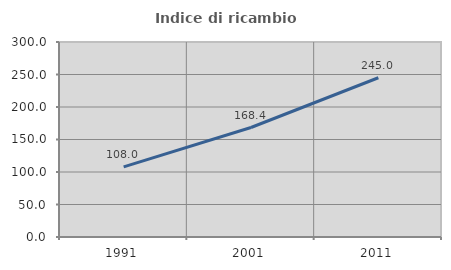
| Category | Indice di ricambio occupazionale  |
|---|---|
| 1991.0 | 107.953 |
| 2001.0 | 168.44 |
| 2011.0 | 245 |